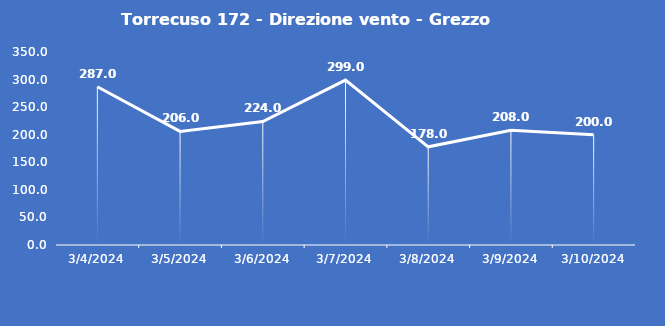
| Category | Torrecuso 172 - Direzione vento - Grezzo (°N) |
|---|---|
| 3/4/24 | 287 |
| 3/5/24 | 206 |
| 3/6/24 | 224 |
| 3/7/24 | 299 |
| 3/8/24 | 178 |
| 3/9/24 | 208 |
| 3/10/24 | 200 |